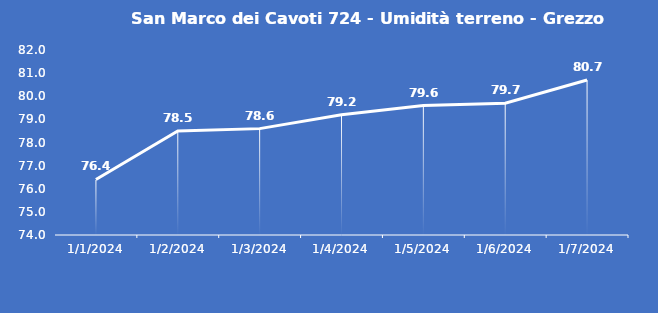
| Category | San Marco dei Cavoti 724 - Umidità terreno - Grezzo (%VWC) |
|---|---|
| 1/1/24 | 76.4 |
| 1/2/24 | 78.5 |
| 1/3/24 | 78.6 |
| 1/4/24 | 79.2 |
| 1/5/24 | 79.6 |
| 1/6/24 | 79.7 |
| 1/7/24 | 80.7 |